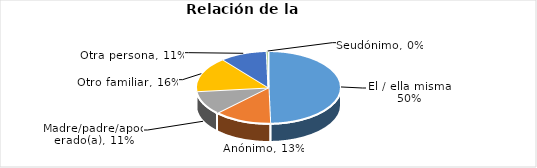
| Category | Series 0 |
|---|---|
| El / ella misma | 0.496 |
| Anónimo | 0.13 |
| Madre/padre/apoderado(a) | 0.107 |
| Otro familiar | 0.158 |
| Otra persona | 0.106 |
| Seudónimo | 0.004 |